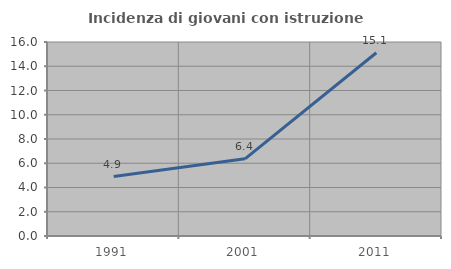
| Category | Incidenza di giovani con istruzione universitaria |
|---|---|
| 1991.0 | 4.902 |
| 2001.0 | 6.364 |
| 2011.0 | 15.116 |